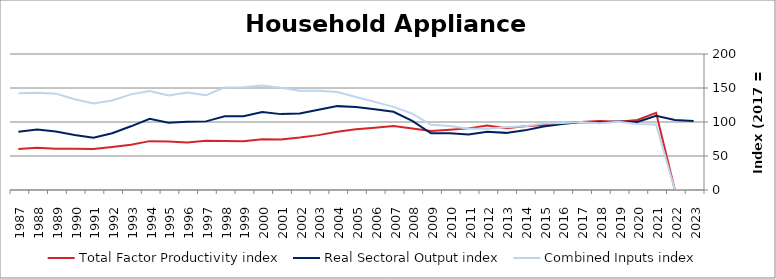
| Category | Total Factor Productivity index | Real Sectoral Output index | Combined Inputs index |
|---|---|---|---|
| 2023.0 | 0 | 101.37 | 0 |
| 2022.0 | 0 | 103.022 | 0 |
| 2021.0 | 113.517 | 109.192 | 96.19 |
| 2020.0 | 103.09 | 100.071 | 97.072 |
| 2019.0 | 100.55 | 100.803 | 100.252 |
| 2018.0 | 101.387 | 99.435 | 98.075 |
| 2017.0 | 100 | 100 | 100 |
| 2016.0 | 98.339 | 96.925 | 98.563 |
| 2015.0 | 95.535 | 93.356 | 97.72 |
| 2014.0 | 93.65 | 87.701 | 93.649 |
| 2013.0 | 90.895 | 84.012 | 92.428 |
| 2012.0 | 95.016 | 85.693 | 90.187 |
| 2011.0 | 90.625 | 81.659 | 90.107 |
| 2010.0 | 88.551 | 83.275 | 94.041 |
| 2009.0 | 86.817 | 83.281 | 95.927 |
| 2008.0 | 90.435 | 101.519 | 112.256 |
| 2007.0 | 94.06 | 115.021 | 122.284 |
| 2006.0 | 91.641 | 118.79 | 129.624 |
| 2005.0 | 89.207 | 121.964 | 136.72 |
| 2004.0 | 85.586 | 123.342 | 144.114 |
| 2003.0 | 80.706 | 117.931 | 146.124 |
| 2002.0 | 77.076 | 112.471 | 145.923 |
| 2001.0 | 74.235 | 111.587 | 150.316 |
| 2000.0 | 74.519 | 114.532 | 153.695 |
| 1999.0 | 71.764 | 108.358 | 150.992 |
| 1998.0 | 71.895 | 108.475 | 150.881 |
| 1997.0 | 72.38 | 100.916 | 139.425 |
| 1996.0 | 69.982 | 100.329 | 143.364 |
| 1995.0 | 71.293 | 99.024 | 138.897 |
| 1994.0 | 71.869 | 104.635 | 145.592 |
| 1993.0 | 66.591 | 93.662 | 140.653 |
| 1992.0 | 63.404 | 83.457 | 131.627 |
| 1991.0 | 60.343 | 76.855 | 127.363 |
| 1990.0 | 60.504 | 80.725 | 133.421 |
| 1989.0 | 60.647 | 85.927 | 141.684 |
| 1988.0 | 62.051 | 88.808 | 143.122 |
| 1987.0 | 60.228 | 85.691 | 142.277 |